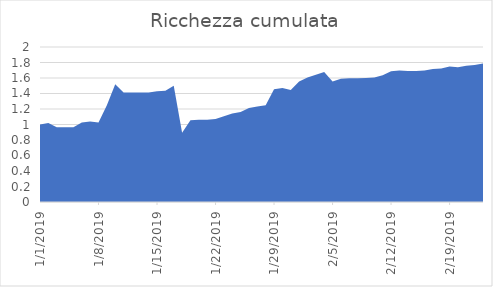
| Category | Series 0 |
|---|---|
| 1/1/19 | 1 |
| 1/2/19 | 1.018 |
| 1/3/19 | 0.964 |
| 1/4/19 | 0.964 |
| 1/5/19 | 0.964 |
| 1/6/19 | 1.025 |
| 1/7/19 | 1.039 |
| 1/8/19 | 1.027 |
| 1/9/19 | 1.25 |
| 1/10/19 | 1.52 |
| 1/11/19 | 1.413 |
| 1/12/19 | 1.414 |
| 1/13/19 | 1.414 |
| 1/14/19 | 1.414 |
| 1/15/19 | 1.43 |
| 1/16/19 | 1.436 |
| 1/17/19 | 1.5 |
| 1/18/19 | 0.893 |
| 1/19/19 | 1.054 |
| 1/20/19 | 1.061 |
| 1/21/19 | 1.063 |
| 1/22/19 | 1.07 |
| 1/23/19 | 1.107 |
| 1/24/19 | 1.143 |
| 1/25/19 | 1.161 |
| 1/26/19 | 1.214 |
| 1/27/19 | 1.232 |
| 1/28/19 | 1.25 |
| 1/29/19 | 1.455 |
| 1/30/19 | 1.471 |
| 1/31/19 | 1.446 |
| 2/1/19 | 1.554 |
| 2/2/19 | 1.607 |
| 2/3/19 | 1.643 |
| 2/4/19 | 1.679 |
| 2/5/19 | 1.554 |
| 2/6/19 | 1.589 |
| 2/7/19 | 1.596 |
| 2/8/19 | 1.598 |
| 2/9/19 | 1.6 |
| 2/10/19 | 1.607 |
| 2/11/19 | 1.634 |
| 2/12/19 | 1.688 |
| 2/13/19 | 1.696 |
| 2/14/19 | 1.691 |
| 2/15/19 | 1.691 |
| 2/16/19 | 1.696 |
| 2/17/19 | 1.716 |
| 2/18/19 | 1.721 |
| 2/19/19 | 1.75 |
| 2/20/19 | 1.739 |
| 2/21/19 | 1.759 |
| 2/22/19 | 1.768 |
| 2/23/19 | 1.786 |